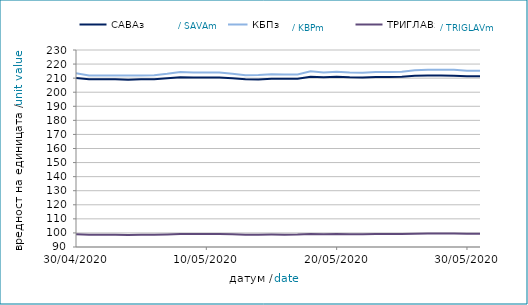
| Category | САВАз | КБПз | ТРИГЛАВз |
|---|---|---|---|
| 30/04/2020 | 210.067 | 213.533 | 99.041 |
| 01/05/2020 | 209.22 | 211.892 | 98.63 |
| 02/05/2020 | 209.232 | 211.905 | 98.635 |
| 03/05/2020 | 209.245 | 211.917 | 98.64 |
| 04/05/2020 | 208.936 | 211.796 | 98.558 |
| 05/05/2020 | 209.185 | 211.931 | 98.679 |
| 06/05/2020 | 209.191 | 212.062 | 98.685 |
| 07/05/2020 | 209.924 | 213.074 | 98.944 |
| 08/05/2020 | 210.649 | 214.332 | 99.226 |
| 09/05/2020 | 210.462 | 214.023 | 99.156 |
| 10/05/2020 | 210.474 | 214.036 | 99.161 |
| 11/05/2020 | 210.473 | 214.017 | 99.193 |
| 12/05/2020 | 209.978 | 213.117 | 98.981 |
| 13/05/2020 | 209.142 | 212.011 | 98.658 |
| 14/05/2020 | 209.102 | 212.167 | 98.665 |
| 15/05/2020 | 209.52 | 212.678 | 98.795 |
| 16/05/2020 | 209.517 | 212.664 | 98.794 |
| 17/05/2020 | 209.53 | 212.677 | 98.798 |
| 18/05/2020 | 210.954 | 214.819 | 99.315 |
| 19/05/2020 | 210.601 | 214.036 | 99.135 |
| 20/05/2020 | 211.003 | 214.573 | 99.247 |
| 21/05/2020 | 210.609 | 214.077 | 99.058 |
| 22/05/2020 | 210.455 | 213.823 | 99.051 |
| 23/05/2020 | 210.77 | 214.324 | 99.165 |
| 24/05/2020 | 210.783 | 214.337 | 99.17 |
| 25/05/2020 | 211.047 | 214.47 | 99.226 |
| 26/05/2020 | 211.618 | 215.564 | 99.454 |
| 27/05/2020 | 211.94 | 216.035 | 99.536 |
| 28/05/2020 | 211.962 | 215.976 | 99.611 |
| 29/05/2020 | 211.778 | 215.882 | 99.546 |
| 30/05/2020 | 211.415 | 215.27 | 99.411 |
| 31/05/2020 | 211.429 | 215.283 | 99.419 |